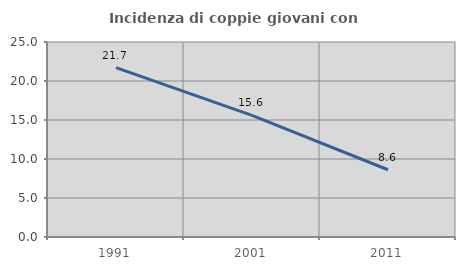
| Category | Incidenza di coppie giovani con figli |
|---|---|
| 1991.0 | 21.705 |
| 2001.0 | 15.602 |
| 2011.0 | 8.621 |